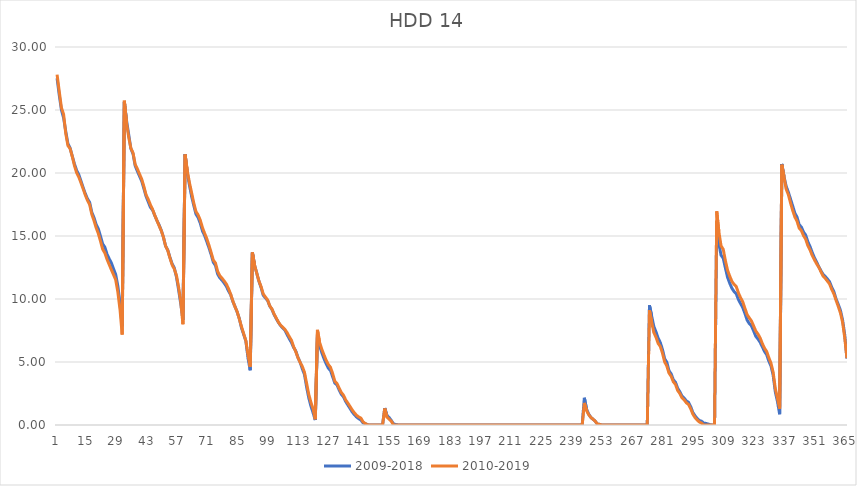
| Category | 2009-2018 | 2010-2019 |
|---|---|---|
| 0 | 27.52 | 27.81 |
| 1 | 26.18 | 26.47 |
| 2 | 25 | 25.18 |
| 3 | 24.38 | 24.66 |
| 4 | 23.29 | 23.13 |
| 5 | 22.32 | 22.18 |
| 6 | 21.98 | 21.94 |
| 7 | 21.34 | 21.31 |
| 8 | 20.72 | 20.59 |
| 9 | 20.21 | 20.03 |
| 10 | 19.87 | 19.68 |
| 11 | 19.36 | 19.23 |
| 12 | 18.86 | 18.74 |
| 13 | 18.36 | 18.25 |
| 14 | 17.95 | 17.82 |
| 15 | 17.67 | 17.5 |
| 16 | 16.88 | 16.72 |
| 17 | 16.46 | 16.23 |
| 18 | 15.91 | 15.66 |
| 19 | 15.57 | 15.2 |
| 20 | 14.99 | 14.6 |
| 21 | 14.38 | 13.96 |
| 22 | 14.12 | 13.66 |
| 23 | 13.57 | 13.15 |
| 24 | 13.2 | 12.74 |
| 25 | 12.86 | 12.33 |
| 26 | 12.4 | 11.93 |
| 27 | 11.96 | 11.53 |
| 28 | 11.03 | 10.56 |
| 29 | 9.66 | 9.17 |
| 30 | 7.83 | 7.18 |
| 31 | 25.65 | 25.74 |
| 32 | 24.16 | 23.98 |
| 33 | 23.05 | 22.85 |
| 34 | 21.93 | 21.97 |
| 35 | 21.52 | 21.6 |
| 36 | 20.57 | 20.67 |
| 37 | 20.14 | 20.32 |
| 38 | 19.74 | 19.91 |
| 39 | 19.35 | 19.51 |
| 40 | 18.77 | 18.93 |
| 41 | 18.16 | 18.27 |
| 42 | 17.72 | 17.91 |
| 43 | 17.29 | 17.48 |
| 44 | 17.06 | 17.12 |
| 45 | 16.64 | 16.65 |
| 46 | 16.24 | 16.23 |
| 47 | 15.88 | 15.82 |
| 48 | 15.45 | 15.43 |
| 49 | 14.91 | 14.91 |
| 50 | 14.21 | 14.21 |
| 51 | 13.89 | 13.86 |
| 52 | 13.31 | 13.26 |
| 53 | 12.8 | 12.72 |
| 54 | 12.47 | 12.38 |
| 55 | 11.76 | 11.88 |
| 56 | 10.74 | 10.94 |
| 57 | 9.63 | 9.78 |
| 58 | 8.33 | 8 |
| 59 | 21.5 | 21.46 |
| 60 | 20.04 | 20.18 |
| 61 | 19.04 | 19.23 |
| 62 | 18.14 | 18.43 |
| 63 | 17.43 | 17.61 |
| 64 | 16.74 | 16.94 |
| 65 | 16.46 | 16.67 |
| 66 | 16.01 | 16.25 |
| 67 | 15.4 | 15.66 |
| 68 | 15.03 | 15.21 |
| 69 | 14.56 | 14.79 |
| 70 | 14.06 | 14.26 |
| 71 | 13.53 | 13.69 |
| 72 | 12.91 | 13.08 |
| 73 | 12.66 | 12.85 |
| 74 | 11.98 | 12.18 |
| 75 | 11.68 | 11.85 |
| 76 | 11.49 | 11.65 |
| 77 | 11.27 | 11.43 |
| 78 | 11.01 | 11.19 |
| 79 | 10.64 | 10.82 |
| 80 | 10.34 | 10.38 |
| 81 | 9.8 | 9.84 |
| 82 | 9.4 | 9.38 |
| 83 | 8.96 | 8.99 |
| 84 | 8.44 | 8.4 |
| 85 | 7.7 | 7.8 |
| 86 | 7.19 | 7.24 |
| 87 | 6.67 | 6.69 |
| 88 | 5.3 | 5.55 |
| 89 | 4.34 | 4.62 |
| 90 | 13.71 | 13.69 |
| 91 | 12.7 | 12.69 |
| 92 | 12.07 | 12.06 |
| 93 | 11.42 | 11.44 |
| 94 | 10.92 | 10.99 |
| 95 | 10.3 | 10.4 |
| 96 | 10.08 | 10.16 |
| 97 | 9.9 | 9.93 |
| 98 | 9.44 | 9.46 |
| 99 | 9.18 | 9.21 |
| 100 | 8.77 | 8.81 |
| 101 | 8.44 | 8.49 |
| 102 | 8.14 | 8.16 |
| 103 | 7.89 | 7.92 |
| 104 | 7.69 | 7.75 |
| 105 | 7.52 | 7.58 |
| 106 | 7.18 | 7.33 |
| 107 | 6.85 | 7.01 |
| 108 | 6.55 | 6.73 |
| 109 | 6.16 | 6.22 |
| 110 | 5.87 | 5.82 |
| 111 | 5.37 | 5.34 |
| 112 | 4.98 | 4.97 |
| 113 | 4.46 | 4.65 |
| 114 | 4.02 | 4.19 |
| 115 | 3.02 | 3.3 |
| 116 | 2.15 | 2.42 |
| 117 | 1.49 | 1.79 |
| 118 | 0.96 | 1.28 |
| 119 | 0.39 | 0.45 |
| 120 | 7.22 | 7.55 |
| 121 | 6.27 | 6.55 |
| 122 | 5.74 | 6.01 |
| 123 | 5.27 | 5.56 |
| 124 | 4.87 | 5.14 |
| 125 | 4.51 | 4.8 |
| 126 | 4.33 | 4.58 |
| 127 | 3.83 | 4.08 |
| 128 | 3.33 | 3.47 |
| 129 | 3.18 | 3.29 |
| 130 | 2.78 | 2.92 |
| 131 | 2.44 | 2.58 |
| 132 | 2.23 | 2.36 |
| 133 | 1.87 | 1.99 |
| 134 | 1.59 | 1.74 |
| 135 | 1.32 | 1.47 |
| 136 | 1.04 | 1.2 |
| 137 | 0.82 | 0.97 |
| 138 | 0.64 | 0.77 |
| 139 | 0.5 | 0.64 |
| 140 | 0.4 | 0.55 |
| 141 | 0.17 | 0.25 |
| 142 | 0.12 | 0.12 |
| 143 | 0.02 | 0.02 |
| 144 | 0 | 0 |
| 145 | 0 | 0 |
| 146 | 0 | 0 |
| 147 | 0 | 0 |
| 148 | 0 | 0 |
| 149 | 0 | 0 |
| 150 | 0 | 0 |
| 151 | 1.34 | 1.31 |
| 152 | 0.77 | 0.63 |
| 153 | 0.6 | 0.47 |
| 154 | 0.36 | 0.31 |
| 155 | 0.1 | 0.01 |
| 156 | 0.04 | 0 |
| 157 | 0.01 | 0 |
| 158 | 0 | 0 |
| 159 | 0 | 0 |
| 160 | 0 | 0 |
| 161 | 0 | 0 |
| 162 | 0 | 0 |
| 163 | 0 | 0 |
| 164 | 0 | 0 |
| 165 | 0 | 0 |
| 166 | 0 | 0 |
| 167 | 0 | 0 |
| 168 | 0 | 0 |
| 169 | 0 | 0 |
| 170 | 0 | 0 |
| 171 | 0 | 0 |
| 172 | 0 | 0 |
| 173 | 0 | 0 |
| 174 | 0 | 0 |
| 175 | 0 | 0 |
| 176 | 0 | 0 |
| 177 | 0 | 0 |
| 178 | 0 | 0 |
| 179 | 0 | 0 |
| 180 | 0 | 0 |
| 181 | 0 | 0 |
| 182 | 0 | 0 |
| 183 | 0 | 0 |
| 184 | 0 | 0 |
| 185 | 0 | 0 |
| 186 | 0 | 0 |
| 187 | 0 | 0 |
| 188 | 0 | 0 |
| 189 | 0 | 0 |
| 190 | 0 | 0 |
| 191 | 0 | 0 |
| 192 | 0 | 0 |
| 193 | 0 | 0 |
| 194 | 0 | 0 |
| 195 | 0 | 0 |
| 196 | 0 | 0 |
| 197 | 0 | 0 |
| 198 | 0 | 0 |
| 199 | 0 | 0 |
| 200 | 0 | 0 |
| 201 | 0 | 0 |
| 202 | 0 | 0 |
| 203 | 0 | 0 |
| 204 | 0 | 0 |
| 205 | 0 | 0 |
| 206 | 0 | 0 |
| 207 | 0 | 0 |
| 208 | 0 | 0 |
| 209 | 0 | 0 |
| 210 | 0 | 0 |
| 211 | 0 | 0 |
| 212 | 0 | 0 |
| 213 | 0 | 0 |
| 214 | 0 | 0 |
| 215 | 0 | 0 |
| 216 | 0 | 0 |
| 217 | 0 | 0 |
| 218 | 0 | 0 |
| 219 | 0 | 0 |
| 220 | 0 | 0 |
| 221 | 0 | 0 |
| 222 | 0 | 0 |
| 223 | 0 | 0 |
| 224 | 0 | 0 |
| 225 | 0 | 0 |
| 226 | 0 | 0 |
| 227 | 0 | 0 |
| 228 | 0 | 0 |
| 229 | 0 | 0 |
| 230 | 0 | 0 |
| 231 | 0 | 0 |
| 232 | 0 | 0 |
| 233 | 0 | 0 |
| 234 | 0 | 0 |
| 235 | 0 | 0 |
| 236 | 0 | 0 |
| 237 | 0 | 0 |
| 238 | 0 | 0 |
| 239 | 0 | 0 |
| 240 | 0 | 0 |
| 241 | 0 | 0 |
| 242 | 0 | 0 |
| 243 | 2.16 | 1.75 |
| 244 | 1.26 | 1.16 |
| 245 | 0.86 | 0.82 |
| 246 | 0.6 | 0.6 |
| 247 | 0.46 | 0.46 |
| 248 | 0.3 | 0.3 |
| 249 | 0.07 | 0.07 |
| 250 | 0.05 | 0.05 |
| 251 | 0 | 0 |
| 252 | 0 | 0 |
| 253 | 0 | 0 |
| 254 | 0 | 0 |
| 255 | 0 | 0 |
| 256 | 0 | 0 |
| 257 | 0 | 0 |
| 258 | 0 | 0 |
| 259 | 0 | 0 |
| 260 | 0 | 0 |
| 261 | 0 | 0 |
| 262 | 0 | 0 |
| 263 | 0 | 0 |
| 264 | 0 | 0 |
| 265 | 0 | 0 |
| 266 | 0 | 0 |
| 267 | 0 | 0 |
| 268 | 0 | 0 |
| 269 | 0 | 0 |
| 270 | 0 | 0 |
| 271 | 0 | 0 |
| 272 | 0 | 0 |
| 273 | 9.51 | 9.11 |
| 274 | 8.66 | 8.18 |
| 275 | 7.83 | 7.35 |
| 276 | 7.39 | 6.97 |
| 277 | 6.89 | 6.48 |
| 278 | 6.54 | 6.23 |
| 279 | 5.99 | 5.7 |
| 280 | 5.26 | 5.01 |
| 281 | 4.98 | 4.68 |
| 282 | 4.31 | 4.12 |
| 283 | 4.06 | 3.87 |
| 284 | 3.59 | 3.43 |
| 285 | 3.39 | 3.22 |
| 286 | 2.91 | 2.74 |
| 287 | 2.64 | 2.5 |
| 288 | 2.3 | 2.16 |
| 289 | 2.13 | 1.99 |
| 290 | 1.91 | 1.76 |
| 291 | 1.8 | 1.63 |
| 292 | 1.46 | 1.29 |
| 293 | 0.99 | 0.87 |
| 294 | 0.73 | 0.59 |
| 295 | 0.51 | 0.39 |
| 296 | 0.36 | 0.24 |
| 297 | 0.3 | 0.15 |
| 298 | 0.15 | 0 |
| 299 | 0.13 | 0 |
| 300 | 0.08 | 0 |
| 301 | 0.02 | 0 |
| 302 | 0 | 0 |
| 303 | 0 | 0 |
| 304 | 16.01 | 16.96 |
| 305 | 14.39 | 15.32 |
| 306 | 13.47 | 14.22 |
| 307 | 13.24 | 13.94 |
| 308 | 12.46 | 13.04 |
| 309 | 11.72 | 12.28 |
| 310 | 11.25 | 11.81 |
| 311 | 10.85 | 11.4 |
| 312 | 10.59 | 11.16 |
| 313 | 10.41 | 10.99 |
| 314 | 9.96 | 10.48 |
| 315 | 9.63 | 10.1 |
| 316 | 9.32 | 9.78 |
| 317 | 8.85 | 9.26 |
| 318 | 8.33 | 8.76 |
| 319 | 8.05 | 8.5 |
| 320 | 7.87 | 8.26 |
| 321 | 7.47 | 7.86 |
| 322 | 7.04 | 7.46 |
| 323 | 6.83 | 7.22 |
| 324 | 6.57 | 6.91 |
| 325 | 6.21 | 6.47 |
| 326 | 5.85 | 6.1 |
| 327 | 5.59 | 5.84 |
| 328 | 5.08 | 5.35 |
| 329 | 4.69 | 4.91 |
| 330 | 3.96 | 4.19 |
| 331 | 2.63 | 2.89 |
| 332 | 1.86 | 2.12 |
| 333 | 0.86 | 1.3 |
| 334 | 20.72 | 20.66 |
| 335 | 19.72 | 19.69 |
| 336 | 18.95 | 18.72 |
| 337 | 18.48 | 18.29 |
| 338 | 17.94 | 17.64 |
| 339 | 17.39 | 17.03 |
| 340 | 16.82 | 16.51 |
| 341 | 16.5 | 16.18 |
| 342 | 15.9 | 15.63 |
| 343 | 15.71 | 15.43 |
| 344 | 15.32 | 15.03 |
| 345 | 15.07 | 14.75 |
| 346 | 14.54 | 14.23 |
| 347 | 14.16 | 13.9 |
| 348 | 13.7 | 13.46 |
| 349 | 13.28 | 13.12 |
| 350 | 12.94 | 12.81 |
| 351 | 12.58 | 12.53 |
| 352 | 12.25 | 12.18 |
| 353 | 11.96 | 11.82 |
| 354 | 11.79 | 11.64 |
| 355 | 11.59 | 11.42 |
| 356 | 11.37 | 11.2 |
| 357 | 10.93 | 10.76 |
| 358 | 10.58 | 10.41 |
| 359 | 10 | 9.9 |
| 360 | 9.57 | 9.42 |
| 361 | 9.11 | 8.91 |
| 362 | 8.34 | 8.16 |
| 363 | 7.15 | 6.92 |
| 364 | 5.27 | 5.3 |